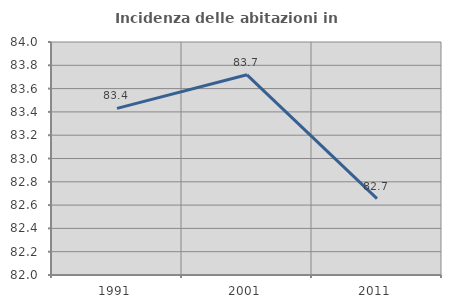
| Category | Incidenza delle abitazioni in proprietà  |
|---|---|
| 1991.0 | 83.43 |
| 2001.0 | 83.718 |
| 2011.0 | 82.656 |